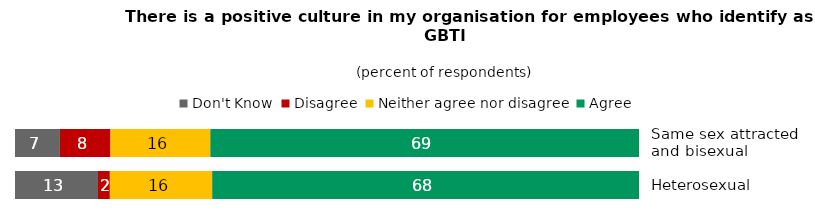
| Category | Don't Know | Disagree | Neither agree nor disagree | Agree |
|---|---|---|---|---|
| Same sex attracted 
and bisexual | 7.2 | 8.1 | 16 | 68.7 |
| Heterosexual | 13.3 | 1.9 | 16.4 | 68.4 |